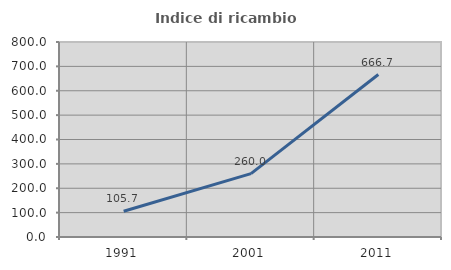
| Category | Indice di ricambio occupazionale  |
|---|---|
| 1991.0 | 105.714 |
| 2001.0 | 260 |
| 2011.0 | 666.667 |